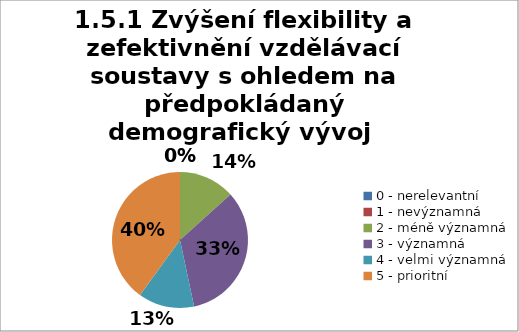
| Category | Series 0 |
|---|---|
| 0 - nerelevantní | 0 |
| 1 - nevýznamná | 0 |
| 2 - méně významná | 13.333 |
| 3 - významná | 33.333 |
| 4 - velmi významná | 13.333 |
| 5 - prioritní | 40 |